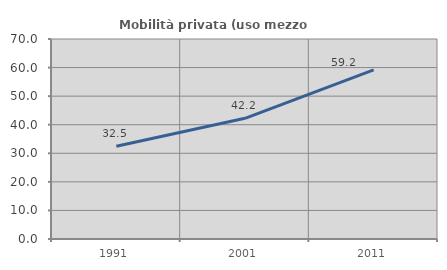
| Category | Mobilità privata (uso mezzo privato) |
|---|---|
| 1991.0 | 32.464 |
| 2001.0 | 42.239 |
| 2011.0 | 59.212 |